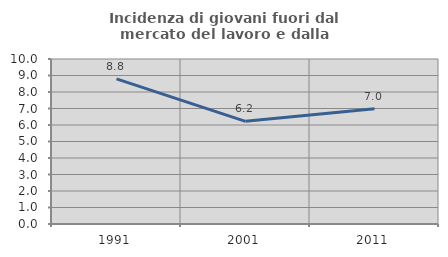
| Category | Incidenza di giovani fuori dal mercato del lavoro e dalla formazione  |
|---|---|
| 1991.0 | 8.792 |
| 2001.0 | 6.223 |
| 2011.0 | 6.981 |